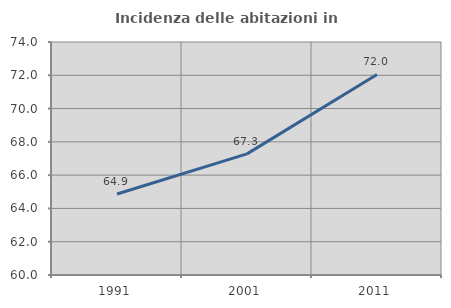
| Category | Incidenza delle abitazioni in proprietà  |
|---|---|
| 1991.0 | 64.869 |
| 2001.0 | 67.278 |
| 2011.0 | 72.05 |